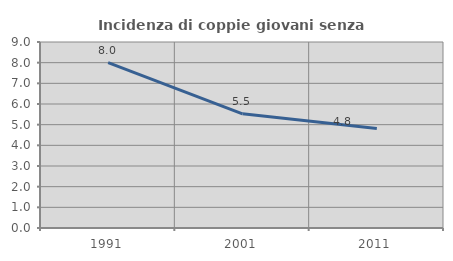
| Category | Incidenza di coppie giovani senza figli |
|---|---|
| 1991.0 | 8.006 |
| 2001.0 | 5.524 |
| 2011.0 | 4.81 |